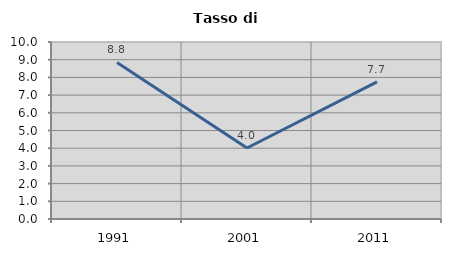
| Category | Tasso di disoccupazione   |
|---|---|
| 1991.0 | 8.842 |
| 2001.0 | 4.013 |
| 2011.0 | 7.749 |